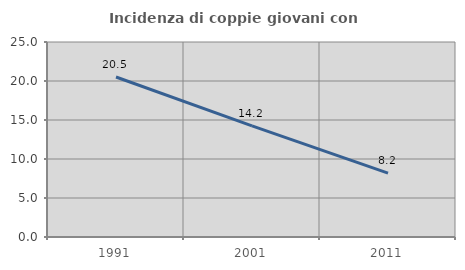
| Category | Incidenza di coppie giovani con figli |
|---|---|
| 1991.0 | 20.513 |
| 2001.0 | 14.243 |
| 2011.0 | 8.199 |